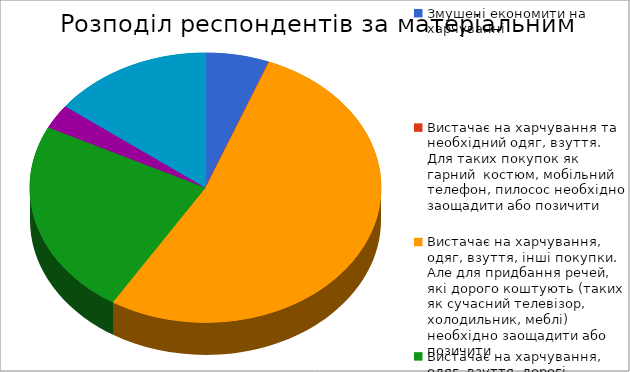
| Category | Series 0 |
|---|---|
| Змушені економити на харчуванні | 2 |
| Вистачає на харчування та необхідний одяг, взуття. Для таких покупок як гарний  костюм, мобільний телефон, пилосос необхідно заощадити або позичити | 0 |
| Вистачає на харчування, одяг, взуття, інші покупки. Але для придбання речей, які дорого коштують (таких як сучасний телевізор, холодильник, меблі) необхідно заощадити або позичити | 18 |
| Вистачає на харчування, одяг, взуття, дорогі покупки. Для таких покупок як машина, квартира необхідно заощадити або позичити | 8 |
| Будь-які необхідні покупки можу зробити в будь-який час | 1 |
| Не відповіли | 5 |